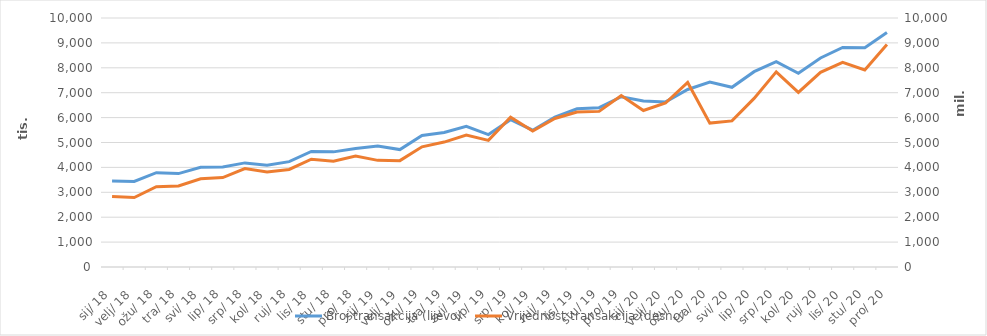
| Category | Broj transakcija (lijevo) |
|---|---|
| 2018-01-01 | 3456341 |
| 2018-02-01 | 3435627 |
| 2018-03-01 | 3786458 |
| 2018-04-01 | 3752314 |
| 2018-05-01 | 4008145 |
| 2018-06-01 | 4014107 |
| 2018-07-01 | 4180803 |
| 2018-08-01 | 4088881 |
| 2018-09-01 | 4232102 |
| 2018-10-01 | 4641779 |
| 2018-11-01 | 4623756 |
| 2018-12-01 | 4759766 |
| 2019-01-01 | 4861422 |
| 2019-02-01 | 4716094 |
| 2019-03-01 | 5283688 |
| 2019-04-01 | 5399494 |
| 2019-05-01 | 5652733 |
| 2019-06-01 | 5317488 |
| 2019-07-01 | 5913972 |
| 2019-08-01 | 5494016 |
| 2019-09-01 | 6017732 |
| 2019-10-01 | 6354348 |
| 2019-11-01 | 6399435 |
| 2019-12-01 | 6839033 |
| 2020-01-01 | 6665571 |
| 2020-02-01 | 6630380 |
| 2020-03-01 | 7128912 |
| 2020-04-01 | 7424201 |
| 2020-05-01 | 7215453 |
| 2020-06-01 | 7844657 |
| 2020-07-01 | 8243807 |
| 2020-08-01 | 7780444 |
| 2020-09-01 | 8393926 |
| 2020-10-01 | 8814951 |
| 2020-11-01 | 8805204 |
| 2020-12-01 | 9413529 |